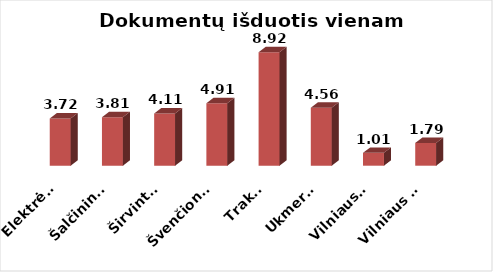
| Category | Series 0 |
|---|---|
|  Elektrėnai | 3.718 |
|  Šalčininkai | 3.811 |
|  Širvintos | 4.111 |
|  Švenčionys | 4.907 |
|  Trakai | 8.919 |
|  Ukmergė | 4.557 |
|  Vilniaus r. | 1.014 |
|  Vilniaus m. | 1.79 |